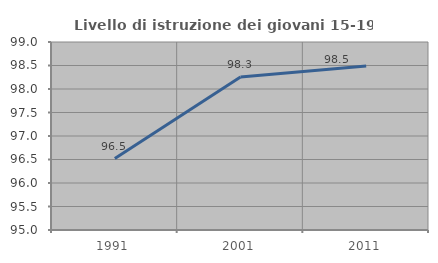
| Category | Livello di istruzione dei giovani 15-19 anni |
|---|---|
| 1991.0 | 96.521 |
| 2001.0 | 98.255 |
| 2011.0 | 98.489 |